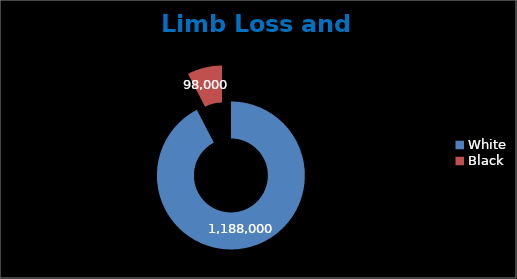
| Category | Limb Loss |
|---|---|
| White | 1188000 |
| Black | 98000 |